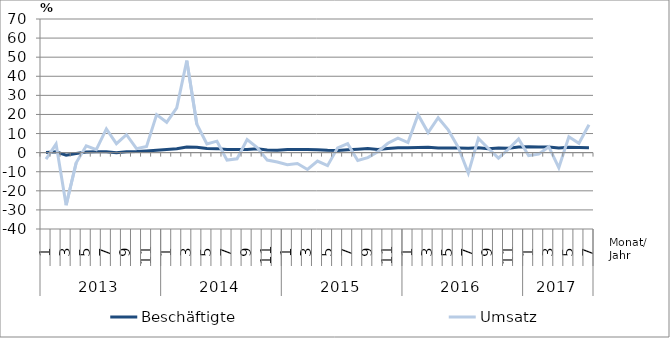
| Category | Beschäftigte | Umsatz |
|---|---|---|
| 0 | 0.1 | -3.4 |
| 1 | 0.4 | 4.5 |
| 2 | -1.3 | -27.5 |
| 3 | -0.4 | -5.3 |
| 4 | 0.3 | 3.6 |
| 5 | 0.4 | 1.6 |
| 6 | 0.4 | 12.4 |
| 7 | 0 | 4.7 |
| 8 | 0.5 | 9.4 |
| 9 | 0.6 | 2.1 |
| 10 | 0.9 | 3.2 |
| 11 | 1.2 | 19.9 |
| 12 | 1.6 | 15.9 |
| 13 | 2 | 23.5 |
| 14 | 2.9 | 48.2 |
| 15 | 2.8 | 14.9 |
| 16 | 2.2 | 4.5 |
| 17 | 2.1 | 6 |
| 18 | 1.6 | -3.9 |
| 19 | 1.6 | -3.2 |
| 20 | 1.6 | 6.8 |
| 21 | 2 | 2.7 |
| 22 | 1.4 | -3.9 |
| 23 | 1.3 | -4.9 |
| 24 | 1.7 | -6.3 |
| 25 | 1.7 | -5.7 |
| 26 | 1.7 | -8.8 |
| 27 | 1.5 | -4.4 |
| 28 | 1.2 | -6.8 |
| 29 | 1.1 | 2.5 |
| 30 | 1.5 | 4.7 |
| 31 | 1.8 | -4.1 |
| 32 | 2.1 | -2.6 |
| 33 | 1.6 | 0.5 |
| 34 | 2.2 | 4.9 |
| 35 | 2.6 | 7.6 |
| 36 | 2.5 | 5.3 |
| 37 | 2.7 | 19.9 |
| 38 | 2.8 | 10.5 |
| 39 | 2.4 | 18.3 |
| 40 | 2.4 | 11.9 |
| 41 | 2.4 | 2.8 |
| 42 | 2.3 | -10.7 |
| 43 | 2.5 | 7.5 |
| 44 | 2 | 2.2 |
| 45 | 2.4 | -2.9 |
| 46 | 2.3 | 1.9 |
| 47 | 2.9 | 7.2 |
| 48 | 3.1 | -1.6 |
| 49 | 3 | -0.8 |
| 50 | 3 | 3.1 |
| 51 | 2.4 | -7.9 |
| 52 | 2.8 | 8.3 |
| 53 | 2.7 | 4.9 |
| 54 | 2.6 | 14.6 |